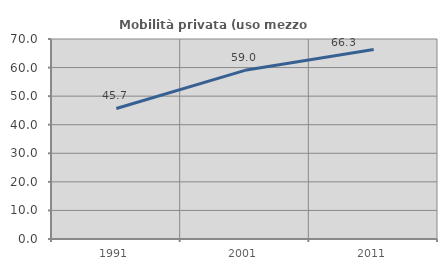
| Category | Mobilità privata (uso mezzo privato) |
|---|---|
| 1991.0 | 45.692 |
| 2001.0 | 59.032 |
| 2011.0 | 66.296 |